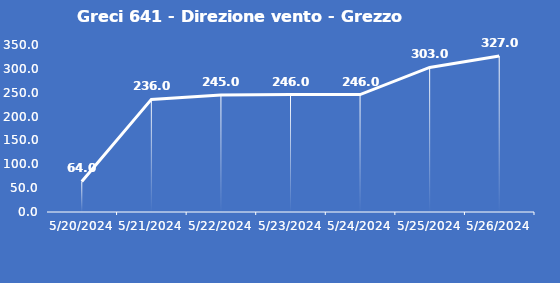
| Category | Greci 641 - Direzione vento - Grezzo (°N) |
|---|---|
| 5/20/24 | 64 |
| 5/21/24 | 236 |
| 5/22/24 | 245 |
| 5/23/24 | 246 |
| 5/24/24 | 246 |
| 5/25/24 | 303 |
| 5/26/24 | 327 |